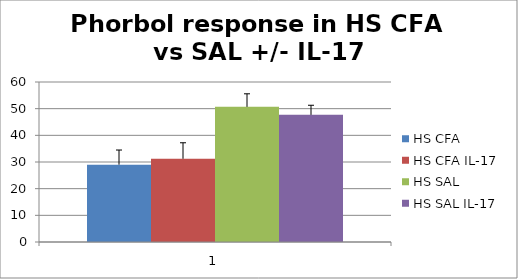
| Category | HS CFA | HS CFA IL-17 | HS SAL | HS SAL IL-17 |
|---|---|---|---|---|
| 0 | 28.992 | 31.211 | 50.675 | 47.68 |